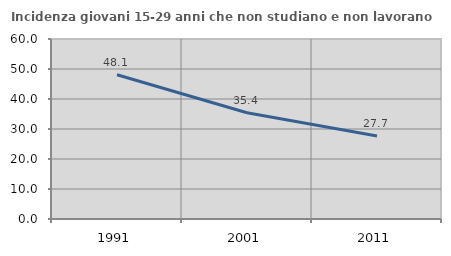
| Category | Incidenza giovani 15-29 anni che non studiano e non lavorano  |
|---|---|
| 1991.0 | 48.08 |
| 2001.0 | 35.417 |
| 2011.0 | 27.675 |